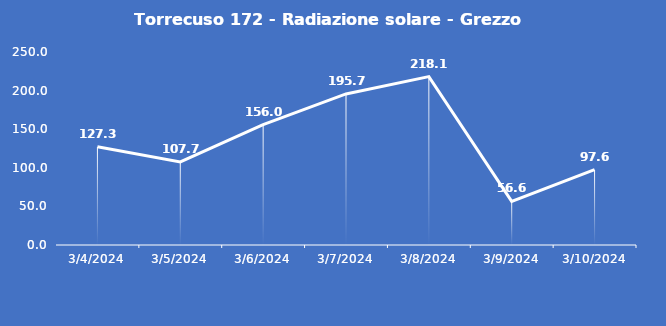
| Category | Torrecuso 172 - Radiazione solare - Grezzo (W/m2) |
|---|---|
| 3/4/24 | 127.3 |
| 3/5/24 | 107.7 |
| 3/6/24 | 156 |
| 3/7/24 | 195.7 |
| 3/8/24 | 218.1 |
| 3/9/24 | 56.6 |
| 3/10/24 | 97.6 |